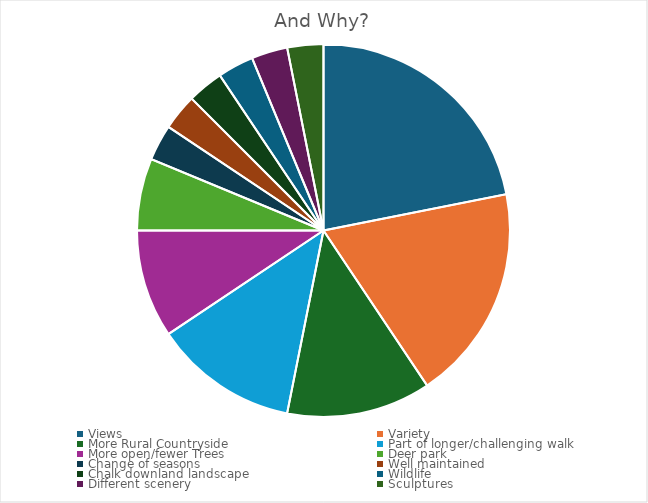
| Category | Series 0 |
|---|---|
| Views | 7 |
| Variety | 6 |
| More Rural Countryside | 4 |
| Part of longer/challenging walk | 4 |
| More open/fewer Trees | 3 |
| Deer park | 2 |
| Change of seasons | 1 |
| Well maintained | 1 |
| Chalk downland landscape | 1 |
| Wildlife | 1 |
| Different scenery | 1 |
| Sculptures | 1 |